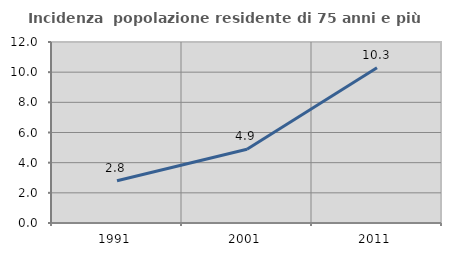
| Category | Incidenza  popolazione residente di 75 anni e più |
|---|---|
| 1991.0 | 2.802 |
| 2001.0 | 4.89 |
| 2011.0 | 10.293 |